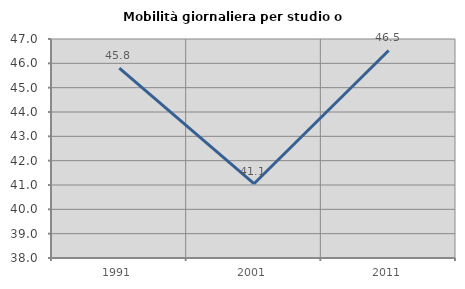
| Category | Mobilità giornaliera per studio o lavoro |
|---|---|
| 1991.0 | 45.8 |
| 2001.0 | 41.053 |
| 2011.0 | 46.53 |